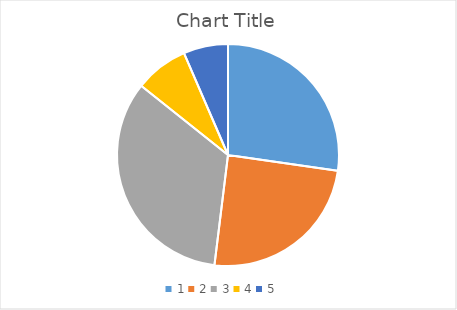
| Category | Series 0 |
|---|---|
| 0 | 27.273 |
| 1 | 24.675 |
| 2 | 33.766 |
| 3 | 7.792 |
| 4 | 6.494 |